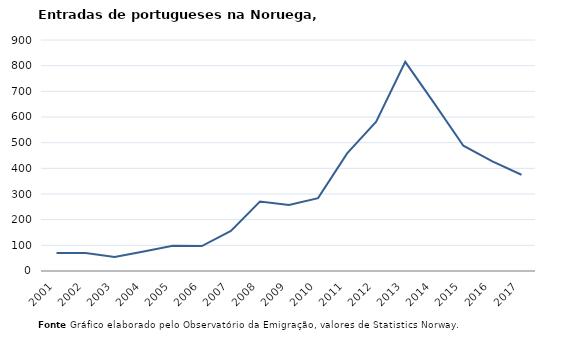
| Category | Entradas |
|---|---|
| 2001.0 | 70 |
| 2002.0 | 70 |
| 2003.0 | 55 |
| 2004.0 | 76 |
| 2005.0 | 98 |
| 2006.0 | 97 |
| 2007.0 | 156 |
| 2008.0 | 271 |
| 2009.0 | 257 |
| 2010.0 | 284 |
| 2011.0 | 458 |
| 2012.0 | 582 |
| 2013.0 | 815 |
| 2014.0 | 653 |
| 2015.0 | 488 |
| 2016.0 | 427 |
| 2017.0 | 375 |